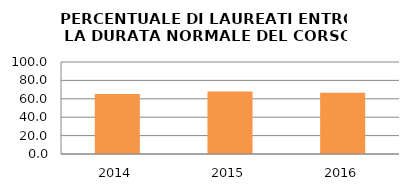
| Category | 2014 2015 2016 |
|---|---|
| 2014.0 | 65.269 |
| 2015.0 | 67.956 |
| 2016.0 | 66.667 |